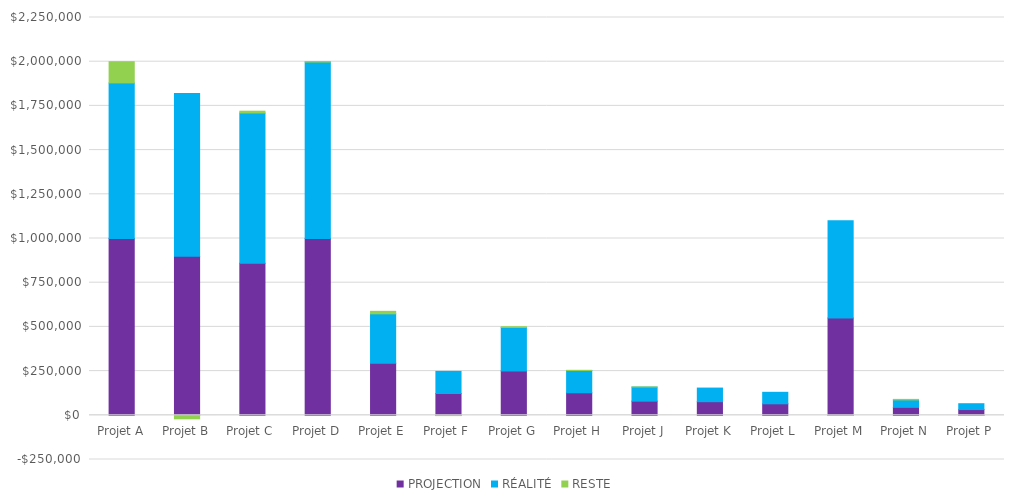
| Category | PROJECTION | RÉALITÉ | RESTE |
|---|---|---|---|
| Projet A | 1000000 | 880000 | 120000 |
| Projet B | 900000 | 920000 | -20000 |
| Projet C | 860000 | 850000 | 10000 |
| Projet D | 1000000 | 998050 | 1950 |
| Projet E | 294000 | 280000 | 14000 |
| Projet F | 123400 | 125000 | -1600 |
| Projet G | 250500 | 246000 | 4500 |
| Projet H | 127200 | 126000 | 1200 |
| Projet J | 80000 | 79900 | 100 |
| Projet K | 77000 | 77000 | 0 |
| Projet L | 65000 | 65000 | 0 |
| Projet M | 550000 | 551000 | -1000 |
| Projet N | 45000 | 42000 | 3000 |
| Projet P | 32500 | 33000 | -500 |